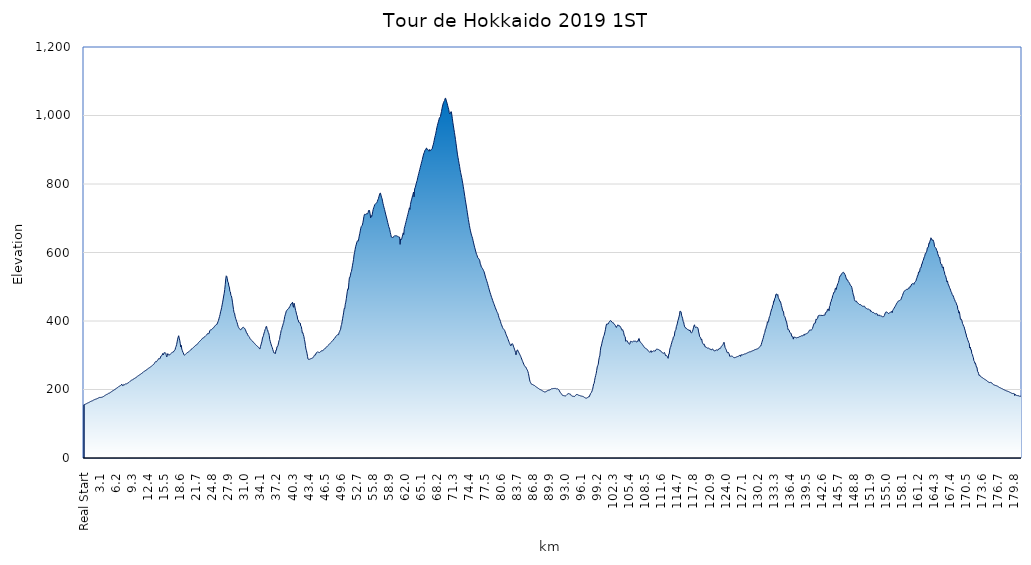
| Category | Ekevation |
|---|---|
| Real Start | 155.5 |
| 0.1  | 156.2 |
| 0.2  | 156.8 |
| 0.3  | 157.3 |
| 0.4  | 158.1 |
| 0.5  | 158.8 |
| 0.6  | 159.6 |
| 0.7  | 160.5 |
| 0.8  | 161.2 |
| 0.9  | 161.8 |
| 1.0  | 162.7 |
| 1.1  | 163.4 |
| 1.2  | 164.4 |
| 1.3  | 165.2 |
| 1.4  | 165.8 |
| 1.5  | 166.5 |
| 1.6  | 167 |
| 1.7  | 167.6 |
| 1.8  | 168.7 |
| 1.9  | 169.6 |
| 2.0  | 170.2 |
| 2.1  | 171 |
| 2.2  | 171.5 |
| 2.3  | 171.9 |
| 2.4  | 172.4 |
| 2.5  | 173.2 |
| 2.6  | 173.8 |
| 2.7  | 174.2 |
| 2.8  | 175.4 |
| 2.9  | 175.5 |
| 3.0  | 176.8 |
| 3.1  | 176.1 |
| 3.2  | 176.9 |
| 3.3  | 177.2 |
| 3.4  | 177.1 |
| 3.5  | 177.5 |
| 3.6  | 178.3 |
| 3.7  | 179.1 |
| 3.8  | 179.8 |
| 3.9  | 180.8 |
| 4.0  | 182.1 |
| 4.1  | 182.8 |
| 4.2  | 184.1 |
| 4.3  | 184.6 |
| 4.4  | 186 |
| 4.5  | 186.3 |
| 4.6  | 187 |
| 4.7  | 188.3 |
| 4.8  | 189.2 |
| 4.9  | 189.1 |
| 5.0  | 190.2 |
| 5.1  | 191.9 |
| 5.2  | 192.4 |
| 5.3  | 193.5 |
| 5.4  | 194.5 |
| 5.5  | 195.6 |
| 5.6  | 196 |
| 5.7  | 197.7 |
| 5.8  | 198.4 |
| 5.9  | 199.1 |
| 6.0  | 200.9 |
| 6.1  | 201.6 |
| 6.2  | 203 |
| 6.3  | 203.7 |
| 6.4  | 204.5 |
| 6.5  | 205.8 |
| 6.6  | 206.7 |
| 6.7  | 208.5 |
| 6.8  | 209.2 |
| 6.9  | 210.1 |
| 7.0  | 210.9 |
| 7.1  | 212 |
| 7.2  | 213.3 |
| 7.3  | 215.7 |
| 7.4  | 212 |
| 7.5  | 210.1 |
| 7.6  | 212.7 |
| 7.7  | 215 |
| 7.8  | 213.8 |
| 7.9  | 215.1 |
| 8.0  | 216.2 |
| 8.1  | 215.9 |
| 8.2  | 216.4 |
| 8.3  | 217.2 |
| 8.4  | 218.1 |
| 8.5  | 219 |
| 8.6  | 220 |
| 8.7  | 221.2 |
| 8.8  | 222.7 |
| 8.9  | 223.8 |
| 9.0  | 225 |
| 9.1  | 226.2 |
| 9.2  | 227.3 |
| 9.3  | 227.8 |
| 9.4  | 228.2 |
| 9.5  | 229.9 |
| 9.6  | 231 |
| 9.7  | 231.7 |
| 9.8  | 232.7 |
| 9.9  | 233.3 |
| 10.0  | 234.2 |
| 10.1  | 235.9 |
| 10.2  | 236.7 |
| 10.3  | 238 |
| 10.4  | 239.8 |
| 10.5  | 240.3 |
| 10.6  | 241.1 |
| 10.7  | 242.4 |
| 10.8  | 243.1 |
| 10.9  | 244.4 |
| 11.0  | 244.8 |
| 11.1  | 246.5 |
| 11.2  | 247.8 |
| 11.3  | 248.7 |
| 11.4  | 249.9 |
| 11.5  | 251.7 |
| 11.6  | 252.6 |
| 11.7  | 253.5 |
| 11.8  | 254.6 |
| 11.9  | 255.1 |
| 12.0  | 257.2 |
| 12.1  | 257.6 |
| 12.2  | 258.6 |
| 12.3  | 259.9 |
| 12.4  | 261.1 |
| 12.5  | 262.3 |
| 12.6  | 263.2 |
| 12.7  | 264.2 |
| 12.8  | 265.5 |
| 12.9  | 266.3 |
| 13.0  | 267.4 |
| 13.1  | 268.8 |
| 13.2  | 270 |
| 13.3  | 271.4 |
| 13.4  | 272.6 |
| 13.5  | 273.7 |
| 13.6  | 276 |
| 13.7  | 279 |
| 13.8  | 281 |
| 13.9  | 282 |
| 14.0  | 281 |
| 14.1  | 283 |
| 14.2  | 285 |
| 14.3  | 287 |
| 14.4  | 290 |
| 14.5  | 290 |
| 14.6  | 290 |
| 14.7  | 290 |
| 14.8  | 295 |
| 14.9  | 298 |
| 15.0  | 299 |
| 15.1  | 300 |
| 15.2  | 305 |
| 15.3  | 300.9 |
| 15.4  | 303.4 |
| 15.5  | 307.8 |
| 15.6  | 307 |
| 15.7  | 307.6 |
| 15.8  | 306 |
| 15.9  | 300.1 |
| 16.0  | 295.3 |
| 16.1  | 299.2 |
| 16.2  | 304.8 |
| 16.3  | 301.8 |
| 16.4  | 300.5 |
| 16.5  | 300.9 |
| 16.6  | 301.8 |
| 16.7  | 303.7 |
| 16.8  | 305.2 |
| 16.9  | 306.5 |
| 17.0  | 307.6 |
| 17.1  | 308.5 |
| 17.2  | 309.3 |
| 17.3  | 309.8 |
| 17.4  | 313 |
| 17.5  | 314 |
| 17.6  | 316 |
| 17.7  | 322 |
| 17.8  | 326 |
| 17.9  | 331 |
| 18.0  | 339 |
| 18.1  | 347 |
| 18.2  | 353 |
| 18.3  | 357 |
| 18.4  | 350 |
| 18.5  | 344 |
| 18.6  | 335 |
| 18.7  | 324 |
| 18.8  | 329 |
| 18.9  | 318 |
| 19.0  | 314 |
| 19.1  | 309 |
| 19.2  | 307 |
| 19.3  | 301.5 |
| 19.4  | 300.6 |
| 19.5  | 301 |
| 19.6  | 302.4 |
| 19.7  | 304.1 |
| 19.8  | 305.4 |
| 19.9  | 307.2 |
| 20.0  | 307.9 |
| 20.1  | 308.9 |
| 20.2  | 309.9 |
| 20.3  | 310.8 |
| 20.4  | 312 |
| 20.5  | 314 |
| 20.6  | 315.3 |
| 20.7  | 316.8 |
| 20.8  | 318.1 |
| 20.9  | 319.4 |
| 21.0  | 320.9 |
| 21.1  | 322.2 |
| 21.2  | 323.2 |
| 21.3  | 324.9 |
| 21.4  | 326.1 |
| 21.5  | 328 |
| 21.6  | 329.2 |
| 21.7  | 330 |
| 21.8  | 331 |
| 21.9  | 332.5 |
| 22.0  | 333.9 |
| 22.1  | 336.5 |
| 22.2  | 338 |
| 22.3  | 339.5 |
| 22.4  | 341.5 |
| 22.5  | 342.8 |
| 22.6  | 344.2 |
| 22.7  | 345.8 |
| 22.8  | 347.7 |
| 22.9  | 349.5 |
| 23.0  | 351 |
| 23.1  | 351.2 |
| 23.2  | 352.4 |
| 23.3  | 353.7 |
| 23.4  | 355 |
| 23.5  | 356.6 |
| 23.6  | 357.8 |
| 23.7  | 359 |
| 23.8  | 361.2 |
| 23.9  | 363.5 |
| 24.0  | 363.7 |
| 24.1  | 362.5 |
| 24.2  | 364.9 |
| 24.3  | 371.5 |
| 24.4  | 373.2 |
| 24.5  | 374.4 |
| 24.6  | 374.3 |
| 24.7  | 375.4 |
| 24.8  | 377.6 |
| 24.9  | 379 |
| 25.0  | 380 |
| 25.1  | 381 |
| 25.2  | 384 |
| 25.3  | 385 |
| 25.4  | 387 |
| 25.5  | 389 |
| 25.6  | 390 |
| 25.7  | 390 |
| 25.8  | 394 |
| 25.9  | 398 |
| 26.0  | 402 |
| 26.1  | 408 |
| 26.2  | 413 |
| 26.3  | 419 |
| 26.4  | 427 |
| 26.5  | 432 |
| 26.6  | 439 |
| 26.7  | 447 |
| 26.8  | 455 |
| 26.9  | 464 |
| 27.0  | 473 |
| 27.1  | 481 |
| 27.2  | 492 |
| 27.3  | 506 |
| 27.4  | 523 |
| 27.5  | 532 |
| 27.6  | 530 |
| 27.7  | 523 |
| 27.8  | 514 |
| 27.9  | 512 |
| 28.0  | 502 |
| 28.1  | 499 |
| 28.2  | 486 |
| 28.3  | 485 |
| 28.4  | 474 |
| 28.5  | 473 |
| 28.6  | 465 |
| 28.7  | 455 |
| 28.8  | 444 |
| 28.9  | 434 |
| 29.0  | 424 |
| 29.1  | 423 |
| 29.2  | 414 |
| 29.3  | 408 |
| 29.4  | 404 |
| 29.5  | 398 |
| 29.6  | 395 |
| 29.7  | 389 |
| 29.8  | 384 |
| 29.9  | 380.7 |
| 30.0  | 378 |
| 30.1  | 376.7 |
| 30.2  | 376 |
| 30.3  | 374.2 |
| 30.4  | 375.5 |
| 30.5  | 378.6 |
| 30.6  | 380 |
| 30.7  | 380 |
| 30.8  | 382 |
| 30.9  | 380.8 |
| 31.0  | 379.4 |
| 31.1  | 377.2 |
| 31.2  | 374.4 |
| 31.3  | 370.6 |
| 31.4  | 365.7 |
| 31.5  | 365 |
| 31.6  | 361.3 |
| 31.7  | 357.8 |
| 31.8  | 356.1 |
| 31.9  | 354.8 |
| 32.0  | 352 |
| 32.1  | 348.5 |
| 32.2  | 346.6 |
| 32.3  | 345.1 |
| 32.4  | 343.3 |
| 32.5  | 341.9 |
| 32.6  | 340.5 |
| 32.7  | 338.7 |
| 32.8  | 337.5 |
| 32.9  | 335.7 |
| 33.0  | 334 |
| 33.1  | 331.9 |
| 33.2  | 330.5 |
| 33.3  | 329.1 |
| 33.4  | 327.8 |
| 33.5  | 326.3 |
| 33.6  | 325.4 |
| 33.7  | 323.7 |
| 33.8  | 321.8 |
| 33.9  | 319.6 |
| 34.0  | 318.2 |
| 34.1  | 325 |
| 34.2  | 330.2 |
| 34.3  | 335.5 |
| 34.4  | 341.1 |
| 34.5  | 350.3 |
| 34.6  | 353.6 |
| 34.7  | 358.3 |
| 34.8  | 364.6 |
| 34.9  | 369 |
| 35.0  | 375 |
| 35.1  | 378 |
| 35.2  | 384 |
| 35.3  | 384 |
| 35.4  | 375 |
| 35.5  | 374 |
| 35.6  | 367 |
| 35.7  | 365 |
| 35.8  | 358 |
| 35.9  | 346 |
| 36.0  | 340.7 |
| 36.1  | 335 |
| 36.2  | 330 |
| 36.3  | 325.4 |
| 36.4  | 322.1 |
| 36.5  | 316.2 |
| 36.6  | 311.7 |
| 36.7  | 307 |
| 36.8  | 306.3 |
| 36.9  | 306.9 |
| 37.0  | 305.1 |
| 37.1  | 315 |
| 37.2  | 315 |
| 37.3  | 325 |
| 37.4  | 325 |
| 37.5  | 329 |
| 37.6  | 336 |
| 37.7  | 343 |
| 37.8  | 346 |
| 37.9  | 357 |
| 38.0  | 363 |
| 38.1  | 372 |
| 38.2  | 375 |
| 38.3  | 382 |
| 38.4  | 386 |
| 38.5  | 392 |
| 38.6  | 396 |
| 38.7  | 404 |
| 38.8  | 413 |
| 38.9  | 418 |
| 39.0  | 423 |
| 39.1  | 429 |
| 39.2  | 431 |
| 39.3  | 433 |
| 39.4  | 435 |
| 39.5  | 436 |
| 39.6  | 437 |
| 39.7  | 441 |
| 39.8  | 442 |
| 39.9  | 446 |
| 40.0  | 450 |
| 40.1  | 451 |
| 40.2  | 451 |
| 40.3  | 455 |
| 40.4  | 444 |
| 40.5  | 440 |
| 40.6  | 452 |
| 40.7  | 446 |
| 40.8  | 438 |
| 40.9  | 431 |
| 41.0  | 426 |
| 41.1  | 418 |
| 41.2  | 415 |
| 41.3  | 405 |
| 41.4  | 403 |
| 41.5  | 397 |
| 41.6  | 395 |
| 41.7  | 395 |
| 41.8  | 394 |
| 41.9  | 385 |
| 42.0  | 384 |
| 42.1  | 375 |
| 42.2  | 365 |
| 42.3  | 366 |
| 42.4  | 360 |
| 42.5  | 355 |
| 42.6  | 346 |
| 42.7  | 339 |
| 42.8  | 328 |
| 42.9  | 318 |
| 43.0  | 313 |
| 43.1  | 306 |
| 43.2  | 297 |
| 43.3  | 289 |
| 43.4  | 288 |
| 43.5  | 287.6 |
| 43.6  | 288.3 |
| 43.7  | 288.8 |
| 43.8  | 289.8 |
| 43.9  | 290.6 |
| 44.0  | 290.7 |
| 44.1  | 291.6 |
| 44.2  | 292.5 |
| 44.3  | 293.3 |
| 44.4  | 295.9 |
| 44.5  | 299.5 |
| 44.6  | 300.4 |
| 44.7  | 300.2 |
| 44.8  | 303.5 |
| 44.9  | 307 |
| 45.0  | 308 |
| 45.1  | 309.6 |
| 45.2  | 310 |
| 45.3  | 309 |
| 45.4  | 308.2 |
| 45.5  | 307.9 |
| 45.6  | 308.9 |
| 45.7  | 310.1 |
| 45.8  | 311.9 |
| 45.9  | 313 |
| 46.0  | 312.4 |
| 46.1  | 313 |
| 46.2  | 314.9 |
| 46.3  | 316 |
| 46.4  | 317.2 |
| 46.5  | 318.1 |
| 46.6  | 320.3 |
| 46.7  | 321.6 |
| 46.8  | 323 |
| 46.9  | 324.3 |
| 47.0  | 325.5 |
| 47.1  | 327 |
| 47.2  | 328.4 |
| 47.3  | 331.1 |
| 47.4  | 331.9 |
| 47.5  | 333.5 |
| 47.6  | 335.4 |
| 47.7  | 337 |
| 47.8  | 338.4 |
| 47.9  | 340.2 |
| 48.0  | 341.8 |
| 48.1  | 343.6 |
| 48.2  | 344.7 |
| 48.3  | 347.5 |
| 48.4  | 349 |
| 48.5  | 350.6 |
| 48.6  | 353.7 |
| 48.7  | 355 |
| 48.8  | 357 |
| 48.9  | 358 |
| 49.0  | 360 |
| 49.1  | 361 |
| 49.2  | 360 |
| 49.3  | 366 |
| 49.4  | 369 |
| 49.5  | 373 |
| 49.6  | 376 |
| 49.7  | 386 |
| 49.8  | 390 |
| 49.9  | 399 |
| 50.0  | 408 |
| 50.1  | 417 |
| 50.2  | 426 |
| 50.3  | 437 |
| 50.4  | 436 |
| 50.5  | 449 |
| 50.6  | 455 |
| 50.7  | 465 |
| 50.8  | 476 |
| 50.9  | 487 |
| 51.0  | 494 |
| 51.1  | 493 |
| 51.2  | 513 |
| 51.3  | 527 |
| 51.4  | 527 |
| 51.5  | 534 |
| 51.6  | 542 |
| 51.7  | 545 |
| 51.8  | 554 |
| 51.9  | 563 |
| 52.0  | 571 |
| 52.1  | 580 |
| 52.2  | 593 |
| 52.3  | 600 |
| 52.4  | 609 |
| 52.5  | 617 |
| 52.6  | 622 |
| 52.7  | 628 |
| 52.8  | 633 |
| 52.9  | 634 |
| 53.0  | 633 |
| 53.1  | 640 |
| 53.2  | 648 |
| 53.3  | 655 |
| 53.4  | 663 |
| 53.5  | 671 |
| 53.6  | 676 |
| 53.7  | 678 |
| 53.8  | 680 |
| 53.9  | 687 |
| 54.0  | 695 |
| 54.1  | 705 |
| 54.2  | 711 |
| 54.3  | 712 |
| 54.4  | 711 |
| 54.5  | 713 |
| 54.6  | 713 |
| 54.7  | 712 |
| 54.8  | 713 |
| 54.9  | 716 |
| 55.0  | 722 |
| 55.1  | 724 |
| 55.2  | 721 |
| 55.3  | 713 |
| 55.4  | 701 |
| 55.5  | 708 |
| 55.6  | 705 |
| 55.7  | 710 |
| 55.8  | 719 |
| 55.9  | 726 |
| 56.0  | 731 |
| 56.1  | 735 |
| 56.2  | 740 |
| 56.3  | 741 |
| 56.4  | 743 |
| 56.5  | 744 |
| 56.6  | 746 |
| 56.7  | 749 |
| 56.8  | 754 |
| 56.9  | 757 |
| 57.0  | 763 |
| 57.1  | 768 |
| 57.2  | 773 |
| 57.3  | 773.4 |
| 57.4  | 767.5 |
| 57.5  | 761.5 |
| 57.6  | 757.9 |
| 57.7  | 750 |
| 57.8  | 742.8 |
| 57.9  | 736.6 |
| 58.0  | 730.7 |
| 58.1  | 725.2 |
| 58.2  | 718.6 |
| 58.3  | 712.3 |
| 58.4  | 706.4 |
| 58.5  | 700.7 |
| 58.6  | 694.6 |
| 58.7  | 687.6 |
| 58.8  | 682.5 |
| 58.9  | 675.5 |
| 59.0  | 671.5 |
| 59.1  | 666.3 |
| 59.2  | 658.4 |
| 59.3  | 652.3 |
| 59.4  | 645.1 |
| 59.5  | 644.2 |
| 59.6  | 644 |
| 59.7  | 643 |
| 59.8  | 645.9 |
| 59.9  | 646.8 |
| 60.0  | 648.7 |
| 60.1  | 648.8 |
| 60.2  | 648.9 |
| 60.3  | 648.8 |
| 60.4  | 648.7 |
| 60.5  | 648.2 |
| 60.6  | 647.3 |
| 60.7  | 646.5 |
| 60.8  | 645.6 |
| 60.9  | 644.7 |
| 61.0  | 644.9 |
| 61.1  | 623.6 |
| 61.2  | 639.6 |
| 61.3  | 637.3 |
| 61.4  | 639.6 |
| 61.5  | 645.4 |
| 61.6  | 651.3 |
| 61.7  | 657.3 |
| 61.8  | 652.3 |
| 61.9  | 669.8 |
| 62.0  | 675.3 |
| 62.1  | 681.1 |
| 62.2  | 687.4 |
| 62.3  | 693.3 |
| 62.4  | 699.6 |
| 62.5  | 705.5 |
| 62.6  | 711.5 |
| 62.7  | 717.6 |
| 62.8  | 723.7 |
| 62.9  | 730.6 |
| 63.0  | 725.6 |
| 63.1  | 740.3 |
| 63.2  | 747.4 |
| 63.3  | 753.7 |
| 63.4  | 759 |
| 63.5  | 765.7 |
| 63.6  | 770.3 |
| 63.7  | 776.6 |
| 63.8  | 762.5 |
| 63.9  | 785.3 |
| 64.0  | 788.9 |
| 64.1  | 794.2 |
| 64.2  | 800.4 |
| 64.3  | 806.1 |
| 64.4  | 810.8 |
| 64.5  | 818.6 |
| 64.6  | 824.4 |
| 64.7  | 830.4 |
| 64.8  | 836.6 |
| 64.9  | 842.4 |
| 65.0  | 848.5 |
| 65.1  | 854.4 |
| 65.2  | 860.4 |
| 65.3  | 866.3 |
| 65.4  | 871.8 |
| 65.5  | 878.7 |
| 65.6  | 884.5 |
| 65.7  | 890.1 |
| 65.8  | 892.8 |
| 65.9  | 898.3 |
| 66.0  | 900.6 |
| 66.1  | 903.6 |
| 66.2  | 905 |
| 66.3  | 900 |
| 66.4  | 901.2 |
| 66.5  | 900.5 |
| 66.6  | 898.9 |
| 66.7  | 895.5 |
| 66.8  | 900.7 |
| 66.9  | 898 |
| 67.0  | 897.6 |
| 67.1  | 900.9 |
| 67.2  | 901.3 |
| 67.3  | 902.8 |
| 67.4  | 910.3 |
| 67.5  | 914.1 |
| 67.6  | 921.3 |
| 67.7  | 928.1 |
| 67.8  | 936 |
| 67.9  | 941.8 |
| 68.0  | 948.3 |
| 68.1  | 956.4 |
| 68.2  | 964.4 |
| 68.3  | 970.4 |
| 68.4  | 976.8 |
| 68.5  | 981.6 |
| 68.6  | 987.7 |
| 68.7  | 993.3 |
| 68.8  | 993.9 |
| 68.9  | 996.6 |
| 69.0  | 1006 |
| 69.1  | 1011.4 |
| 69.2  | 1020.8 |
| 69.3  | 1027.6 |
| 69.4  | 1033.5 |
| 69.5  | 1038.3 |
| 69.6  | 1041.6 |
| 69.7  | 1043.7 |
| 69.8  | 1050.1 |
| 69.9  | 1050.3 |
| 70.0  | 1045 |
| 70.1  | 1039.6 |
| 70.2  | 1035.1 |
| 70.3  | 1028.4 |
| 70.4  | 1022.9 |
| 70.5  | 1017.3 |
| 70.6  | 1008.3 |
| 70.7  | 1004.6 |
| 70.8  | 1007.9 |
| 70.9  | 1010.8 |
| 71.0  | 1010.9 |
| 71.1  | 1001.4 |
| 71.2  | 990.6 |
| 71.3  | 979.2 |
| 71.4  | 969.6 |
| 71.5  | 959.7 |
| 71.6  | 950.3 |
| 71.7  | 940.4 |
| 71.8  | 930.2 |
| 71.9  | 919.1 |
| 72.0  | 907.8 |
| 72.1  | 896.4 |
| 72.2  | 885 |
| 72.3  | 877 |
| 72.4  | 867.8 |
| 72.5  | 859.6 |
| 72.6  | 851.2 |
| 72.7  | 841.4 |
| 72.8  | 833.3 |
| 72.9  | 826.4 |
| 73.0  | 819.3 |
| 73.1  | 811.2 |
| 73.2  | 802.3 |
| 73.3  | 793.3 |
| 73.4  | 783.7 |
| 73.5  | 773.9 |
| 73.6  | 764 |
| 73.7  | 753.9 |
| 73.8  | 744.6 |
| 73.9  | 735.6 |
| 74.0  | 725.9 |
| 74.1  | 715.9 |
| 74.2  | 705.8 |
| 74.3  | 696.1 |
| 74.4  | 687.3 |
| 74.5  | 678.4 |
| 74.6  | 670.4 |
| 74.7  | 663.2 |
| 74.8  | 656.7 |
| 74.9  | 650.8 |
| 75.0  | 646.5 |
| 75.1  | 641.5 |
| 75.2  | 634.6 |
| 75.3  | 628.1 |
| 75.4  | 621.6 |
| 75.5  | 615.2 |
| 75.6  | 610 |
| 75.7  | 604.4 |
| 75.8  | 598.3 |
| 75.9  | 594.1 |
| 76.0  | 590.4 |
| 76.1  | 584.9 |
| 76.2  | 583.8 |
| 76.3  | 581.6 |
| 76.4  | 579.6 |
| 76.5  | 575.6 |
| 76.6  | 566.7 |
| 76.7  | 563.9 |
| 76.8  | 557.6 |
| 76.9  | 555.8 |
| 77.0  | 553.8 |
| 77.1  | 551.2 |
| 77.2  | 547.9 |
| 77.3  | 545.1 |
| 77.4  | 540.2 |
| 77.5  | 534.4 |
| 77.6  | 528.5 |
| 77.7  | 523.6 |
| 77.8  | 519.1 |
| 77.9  | 514.4 |
| 78.0  | 509.6 |
| 78.1  | 504 |
| 78.2  | 498.1 |
| 78.3  | 492.9 |
| 78.4  | 487.6 |
| 78.5  | 482.5 |
| 78.6  | 477.8 |
| 78.7  | 472.8 |
| 78.8  | 468.3 |
| 78.9  | 464.1 |
| 79.0  | 459.7 |
| 79.1  | 455.1 |
| 79.2  | 451.4 |
| 79.3  | 447.3 |
| 79.4  | 443.3 |
| 79.5  | 438.8 |
| 79.6  | 435 |
| 79.7  | 431.7 |
| 79.8  | 427.4 |
| 79.9  | 424.5 |
| 80.0  | 421.8 |
| 80.1  | 416.3 |
| 80.2  | 410.3 |
| 80.3  | 406.5 |
| 80.4  | 403 |
| 80.5  | 398.4 |
| 80.6  | 392.9 |
| 80.7  | 389 |
| 80.8  | 385.2 |
| 80.9  | 381.2 |
| 81.0  | 378.2 |
| 81.1  | 376.5 |
| 81.2  | 374.8 |
| 81.3  | 372.5 |
| 81.4  | 368.5 |
| 81.5  | 364.1 |
| 81.6  | 359.9 |
| 81.7  | 356.5 |
| 81.8  | 353.1 |
| 81.9  | 348.9 |
| 82.0  | 345.1 |
| 82.1  | 341 |
| 82.2  | 337 |
| 82.3  | 333.5 |
| 82.4  | 330.1 |
| 82.5  | 327.5 |
| 82.6  | 329.8 |
| 82.7  | 333.3 |
| 82.8  | 333.8 |
| 82.9  | 331.2 |
| 83.0  | 326.6 |
| 83.1  | 322.2 |
| 83.2  | 317.8 |
| 83.3  | 313.2 |
| 83.4  | 308.8 |
| 83.5  | 301.2 |
| 83.6  | 308.5 |
| 83.7  | 314.9 |
| 83.8  | 315.6 |
| 83.9  | 312.1 |
| 84.0  | 309.2 |
| 84.1  | 306.1 |
| 84.2  | 303.2 |
| 84.3  | 300 |
| 84.4  | 296.9 |
| 84.5  | 292.9 |
| 84.6  | 289 |
| 84.7  | 285.2 |
| 84.8  | 281.4 |
| 84.9  | 277.6 |
| 85.0  | 273.9 |
| 85.1  | 270.5 |
| 85.2  | 267.5 |
| 85.3  | 266.7 |
| 85.4  | 265.5 |
| 85.5  | 262.1 |
| 85.6  | 259.1 |
| 85.7  | 256.4 |
| 85.8  | 252.2 |
| 85.9  | 246.8 |
| 86.0  | 239 |
| 86.1  | 230.5 |
| 86.2  | 223.9 |
| 86.3  | 220.8 |
| 86.4  | 218 |
| 86.5  | 215.4 |
| 86.6  | 214.8 |
| 86.7  | 214.5 |
| 86.8  | 213.7 |
| 86.9  | 212.8 |
| 87.0  | 212.3 |
| 87.1  | 211.3 |
| 87.2  | 210 |
| 87.3  | 208.7 |
| 87.4  | 207.7 |
| 87.5  | 206.5 |
| 87.6  | 205.4 |
| 87.7  | 204.7 |
| 87.8  | 203.6 |
| 87.9  | 202.4 |
| 88.0  | 201.3 |
| 88.1  | 200.2 |
| 88.2  | 199.6 |
| 88.3  | 199.2 |
| 88.4  | 198.2 |
| 88.5  | 197.4 |
| 88.6  | 196.3 |
| 88.7  | 195.4 |
| 88.8  | 194.5 |
| 88.9  | 193.6 |
| 89.0  | 193 |
| 89.1  | 192.7 |
| 89.2  | 193.2 |
| 89.3  | 194.1 |
| 89.4  | 194.8 |
| 89.5  | 195.8 |
| 89.6  | 196.7 |
| 89.7  | 197.6 |
| 89.8  | 197.8 |
| 89.9  | 197.9 |
| 90.0  | 198.7 |
| 90.1  | 199.3 |
| 90.2  | 200.3 |
| 90.3  | 201.7 |
| 90.4  | 202.1 |
| 90.5  | 202.1 |
| 90.6  | 202.6 |
| 90.7  | 202.9 |
| 90.8  | 202.8 |
| 90.9  | 202.9 |
| 91.0  | 203.3 |
| 91.1  | 203.4 |
| 91.2  | 202.2 |
| 91.3  | 201.8 |
| 91.4  | 201.9 |
| 91.5  | 202.1 |
| 91.6  | 201.2 |
| 91.7  | 200.2 |
| 91.8  | 198.9 |
| 91.9  | 196 |
| 92.0  | 192.6 |
| 92.1  | 190.7 |
| 92.2  | 188.8 |
| 92.3  | 186.6 |
| 92.4  | 184.4 |
| 92.5  | 183 |
| 92.6  | 182.4 |
| 92.7  | 182.2 |
| 92.8  | 181.9 |
| 92.9  | 181.5 |
| 93.0  | 181.2 |
| 93.1  | 181.5 |
| 93.2  | 182.7 |
| 93.3  | 184.2 |
| 93.4  | 185.9 |
| 93.5  | 187.1 |
| 93.6  | 187.7 |
| 93.7  | 188.3 |
| 93.8  | 188 |
| 93.9  | 185.9 |
| 94.0  | 186.2 |
| 94.1  | 185.1 |
| 94.2  | 182.1 |
| 94.3  | 180.6 |
| 94.4  | 180.5 |
| 94.5  | 180.4 |
| 94.6  | 180.1 |
| 94.7  | 179.5 |
| 94.8  | 179.5 |
| 94.9  | 180.9 |
| 95.0  | 182.8 |
| 95.1  | 184.8 |
| 95.2  | 185.2 |
| 95.3  | 185.8 |
| 95.4  | 185 |
| 95.5  | 184.3 |
| 95.6  | 183.2 |
| 95.7  | 182.8 |
| 95.8  | 182.5 |
| 95.9  | 182.1 |
| 96.0  | 181.2 |
| 96.1  | 181 |
| 96.2  | 180.5 |
| 96.3  | 180.3 |
| 96.4  | 179.8 |
| 96.5  | 179.2 |
| 96.6  | 178.5 |
| 96.7  | 177.3 |
| 96.8  | 176.3 |
| 96.9  | 175.5 |
| 97.0  | 174.8 |
| 97.1  | 174.8 |
| 97.2  | 175.1 |
| 97.3  | 176.1 |
| 97.4  | 177.3 |
| 97.5  | 178.5 |
| 97.6  | 177.8 |
| 97.7  | 181 |
| 97.8  | 184 |
| 97.9  | 188 |
| 98.0  | 190 |
| 98.1  | 192 |
| 98.2  | 196 |
| 98.3  | 200 |
| 98.4  | 208 |
| 98.5  | 216 |
| 98.6  | 218 |
| 98.7  | 227 |
| 98.8  | 235 |
| 98.9  | 241 |
| 99.0  | 247 |
| 99.1  | 256 |
| 99.2  | 266 |
| 99.3  | 270 |
| 99.4  | 274 |
| 99.5  | 286 |
| 99.6  | 294 |
| 99.7  | 298 |
| 99.8  | 313 |
| 99.9  | 324 |
| 100.0  | 327 |
| 100.1  | 335 |
| 100.2  | 342 |
| 100.3  | 347 |
| 100.4  | 354 |
| 100.5  | 357 |
| 100.6  | 362 |
| 100.7  | 369 |
| 100.8  | 376 |
| 100.9  | 385 |
| 101.0  | 391 |
| 101.1  | 391 |
| 101.2  | 391 |
| 101.3  | 391 |
| 101.4  | 395 |
| 101.5  | 396 |
| 101.6  | 399 |
| 101.7  | 401 |
| 101.8  | 401 |
| 101.9  | 400 |
| 102.0  | 397 |
| 102.1  | 396 |
| 102.2  | 395 |
| 102.3  | 395 |
| 102.4  | 392 |
| 102.5  | 391 |
| 102.6  | 389 |
| 102.7  | 387 |
| 102.8  | 383 |
| 102.9  | 381 |
| 103.0  | 385 |
| 103.1  | 386 |
| 103.2  | 389 |
| 103.3  | 387 |
| 103.4  | 385 |
| 103.5  | 386 |
| 103.6  | 385 |
| 103.7  | 382 |
| 103.8  | 380 |
| 103.9  | 375 |
| 104.0  | 373 |
| 104.1  | 375 |
| 104.2  | 371 |
| 104.3  | 367 |
| 104.4  | 359 |
| 104.5  | 355 |
| 104.6  | 354 |
| 104.7  | 341 |
| 104.8  | 341 |
| 104.9  | 343 |
| 105.0  | 342 |
| 105.1  | 339 |
| 105.2  | 336 |
| 105.3  | 334 |
| 105.4  | 332 |
| 105.5  | 333 |
| 105.6  | 340 |
| 105.7  | 341 |
| 105.8  | 340 |
| 105.9  | 340 |
| 106.0  | 339 |
| 106.1  | 340 |
| 106.2  | 341 |
| 106.3  | 342 |
| 106.4  | 341 |
| 106.5  | 342 |
| 106.6  | 341 |
| 106.7  | 340 |
| 106.8  | 339 |
| 106.9  | 339 |
| 107.0  | 342 |
| 107.1  | 341 |
| 107.2  | 348 |
| 107.3  | 349 |
| 107.4  | 341.3 |
| 107.5  | 338.9 |
| 107.6  | 337.7 |
| 107.7  | 335.6 |
| 107.8  | 334.1 |
| 107.9  | 331.8 |
| 108.0  | 330.1 |
| 108.1  | 327.7 |
| 108.2  | 325.5 |
| 108.3  | 322.9 |
| 108.4  | 321.6 |
| 108.5  | 320.5 |
| 108.6  | 320 |
| 108.7  | 318.8 |
| 108.8  | 317.4 |
| 108.9  | 316.6 |
| 109.0  | 314.1 |
| 109.1  | 311.8 |
| 109.2  | 310.5 |
| 109.3  | 309.4 |
| 109.4  | 308.9 |
| 109.5  | 309.7 |
| 109.6  | 313.5 |
| 109.7  | 308.7 |
| 109.8  | 310 |
| 109.9  | 311 |
| 110.0  | 312 |
| 110.1  | 313 |
| 110.2  | 313 |
| 110.3  | 312 |
| 110.4  | 312 |
| 110.5  | 315 |
| 110.6  | 317 |
| 110.7  | 318 |
| 110.8  | 318 |
| 110.9  | 317 |
| 111.0  | 317 |
| 111.1  | 316 |
| 111.2  | 315 |
| 111.3  | 315 |
| 111.4  | 313 |
| 111.5  | 312 |
| 111.6  | 310 |
| 111.7  | 309 |
| 111.8  | 307 |
| 111.9  | 306 |
| 112.0  | 306 |
| 112.1  | 306 |
| 112.2  | 308 |
| 112.3  | 304 |
| 112.4  | 299 |
| 112.5  | 299 |
| 112.6  | 299 |
| 112.7  | 297 |
| 112.8  | 294 |
| 112.9  | 291 |
| 113.0  | 303 |
| 113.1  | 303 |
| 113.2  | 315 |
| 113.3  | 322 |
| 113.4  | 324 |
| 113.5  | 332 |
| 113.6  | 336 |
| 113.7  | 343 |
| 113.8  | 344 |
| 113.9  | 353 |
| 114.0  | 354 |
| 114.1  | 356 |
| 114.2  | 368 |
| 114.3  | 372 |
| 114.4  | 375 |
| 114.5  | 384 |
| 114.6  | 388 |
| 114.7  | 394 |
| 114.8  | 401 |
| 114.9  | 406 |
| 115.0  | 412 |
| 115.1  | 418 |
| 115.2  | 429 |
| 115.3  | 428 |
| 115.4  | 427 |
| 115.5  | 417 |
| 115.6  | 412 |
| 115.7  | 408 |
| 115.8  | 399 |
| 115.9  | 397 |
| 116.0  | 389 |
| 116.1  | 383 |
| 116.2  | 382 |
| 116.3  | 379 |
| 116.4  | 379 |
| 116.5  | 377 |
| 116.6  | 376 |
| 116.7  | 375 |
| 116.8  | 375 |
| 116.9  | 373 |
| 117.0  | 371 |
| 117.1  | 374 |
| 117.2  | 371 |
| 117.3  | 367 |
| 117.4  | 365 |
| 117.5  | 366 |
| 117.6  | 370 |
| 117.7  | 374 |
| 117.8  | 380 |
| 117.9  | 386 |
| 118.0  | 389 |
| 118.1  | 383 |
| 118.2  | 381 |
| 118.3  | 382 |
| 118.4  | 382 |
| 118.5  | 381 |
| 118.6  | 381 |
| 118.7  | 377 |
| 118.8  | 368 |
| 118.9  | 362 |
| 119.0  | 354 |
| 119.1  | 353 |
| 119.2  | 351 |
| 119.3  | 345 |
| 119.4  | 347 |
| 119.5  | 338 |
| 119.6  | 335 |
| 119.7  | 332 |
| 119.8  | 331 |
| 119.9  | 332 |
| 120.0  | 327 |
| 120.1  | 323.8 |
| 120.2  | 324.3 |
| 120.3  | 323 |
| 120.4  | 322 |
| 120.5  | 320.9 |
| 120.6  | 320.9 |
| 120.7  | 320.9 |
| 120.8  | 319.8 |
| 120.9  | 318.8 |
| 121.0  | 319 |
| 121.1  | 317.7 |
| 121.2  | 315.5 |
| 121.3  | 315.9 |
| 121.4  | 318 |
| 121.5  | 318 |
| 121.6  | 317 |
| 121.7  | 314 |
| 121.8  | 313 |
| 121.9  | 313 |
| 122.0  | 313 |
| 122.1  | 315 |
| 122.2  | 316 |
| 122.3  | 315 |
| 122.4  | 314 |
| 122.5  | 315 |
| 122.6  | 318 |
| 122.7  | 317 |
| 122.8  | 320 |
| 122.9  | 320 |
| 123.0  | 320 |
| 123.1  | 323 |
| 123.2  | 326 |
| 123.3  | 328 |
| 123.4  | 329 |
| 123.5  | 331 |
| 123.6  | 335 |
| 123.7  | 338 |
| 123.8  | 332 |
| 123.9  | 323 |
| 124.0  | 320 |
| 124.1  | 317 |
| 124.2  | 313 |
| 124.3  | 308 |
| 124.4  | 307 |
| 124.5  | 309 |
| 124.6  | 306 |
| 124.7  | 304 |
| 124.8  | 296.9 |
| 124.9  | 296.4 |
| 125.0  | 297.6 |
| 125.1  | 297.3 |
| 125.2  | 297.9 |
| 125.3  | 297.3 |
| 125.4  | 296.1 |
| 125.5  | 295 |
| 125.6  | 293.2 |
| 125.7  | 293 |
| 125.8  | 293 |
| 125.9  | 293.6 |
| 126.0  | 294.1 |
| 126.1  | 295 |
| 126.2  | 295.5 |
| 126.3  | 296.1 |
| 126.4  | 296.7 |
| 126.5  | 297.3 |
| 126.6  | 298 |
| 126.7  | 299.4 |
| 126.8  | 300.8 |
| 126.9  | 296.7 |
| 127.0  | 301.7 |
| 127.1  | 301 |
| 127.2  | 300.8 |
| 127.3  | 301.3 |
| 127.4  | 302 |
| 127.5  | 302.5 |
| 127.6  | 303.2 |
| 127.7  | 303.9 |
| 127.8  | 304 |
| 127.9  | 304.5 |
| 128.0  | 305 |
| 128.1  | 306.3 |
| 128.2  | 306.9 |
| 128.3  | 307.6 |
| 128.4  | 308.2 |
| 128.5  | 309 |
| 128.6  | 309.6 |
| 128.7  | 310.3 |
| 128.8  | 310.1 |
| 128.9  | 311 |
| 129.0  | 311.6 |
| 129.1  | 311.9 |
| 129.2  | 312.9 |
| 129.3  | 313.5 |
| 129.4  | 314 |
| 129.5  | 315 |
| 129.6  | 315.8 |
| 129.7  | 316.3 |
| 129.8  | 316.9 |
| 129.9  | 317 |
| 130.0  | 318 |
| 130.1  | 318.8 |
| 130.2  | 318.9 |
| 130.3  | 320 |
| 130.4  | 321 |
| 130.5  | 322.4 |
| 130.6  | 325.1 |
| 130.7  | 326.2 |
| 130.8  | 327 |
| 130.9  | 331.1 |
| 131.0  | 336.6 |
| 131.1  | 341.5 |
| 131.2  | 346.5 |
| 131.3  | 351.1 |
| 131.4  | 357.8 |
| 131.5  | 363 |
| 131.6  | 367 |
| 131.7  | 376 |
| 131.8  | 377 |
| 131.9  | 385 |
| 132.0  | 388 |
| 132.1  | 398 |
| 132.2  | 396 |
| 132.3  | 398 |
| 132.4  | 408 |
| 132.5  | 413 |
| 132.6  | 416 |
| 132.7  | 424 |
| 132.8  | 429 |
| 132.9  | 435 |
| 133.0  | 437 |
| 133.1  | 446 |
| 133.2  | 447 |
| 133.3  | 458 |
| 133.4  | 457 |
| 133.5  | 466 |
| 133.6  | 467 |
| 133.7  | 476 |
| 133.8  | 479 |
| 133.9  | 479 |
| 134.0  | 475 |
| 134.1  | 477 |
| 134.2  | 468 |
| 134.3  | 465 |
| 134.4  | 462 |
| 134.5  | 457 |
| 134.6  | 457 |
| 134.7  | 452 |
| 134.8  | 445 |
| 134.9  | 440 |
| 135.0  | 432 |
| 135.1  | 428 |
| 135.2  | 428 |
| 135.3  | 416 |
| 135.4  | 414 |
| 135.5  | 411 |
| 135.6  | 406 |
| 135.7  | 400 |
| 135.8  | 397 |
| 135.9  | 389 |
| 136.0  | 381 |
| 136.1  | 374 |
| 136.2  | 375 |
| 136.3  | 373 |
| 136.4  | 367 |
| 136.5  | 366 |
| 136.6  | 365 |
| 136.7  | 362 |
| 136.8  | 355 |
| 136.9  | 355.2 |
| 137.0  | 354.1 |
| 137.1  | 347 |
| 137.2  | 353.3 |
| 137.3  | 353.2 |
| 137.4  | 351.9 |
| 137.5  | 352.1 |
| 137.6  | 351.4 |
| 137.7  | 350.8 |
| 137.8  | 351.3 |
| 137.9  | 351.8 |
| 138.0  | 352.2 |
| 138.1  | 352.4 |
| 138.2  | 353.7 |
| 138.3  | 354.3 |
| 138.4  | 354.6 |
| 138.5  | 355.2 |
| 138.6  | 356.2 |
| 138.7  | 356.9 |
| 138.8  | 356.8 |
| 138.9  | 356.9 |
| 139.0  | 357.4 |
| 139.1  | 360.2 |
| 139.2  | 358.2 |
| 139.3  | 361.5 |
| 139.4  | 361.5 |
| 139.5  | 362 |
| 139.6  | 362.8 |
| 139.7  | 363.4 |
| 139.8  | 364.5 |
| 139.9  | 365.2 |
| 140.0  | 366.5 |
| 140.1  | 369.8 |
| 140.2  | 372.8 |
| 140.3  | 373.8 |
| 140.4  | 373.6 |
| 140.5  | 374 |
| 140.6  | 373.9 |
| 140.7  | 375.1 |
| 140.8  | 378.1 |
| 140.9  | 382.9 |
| 141.0  | 388 |
| 141.1  | 391.7 |
| 141.2  | 394 |
| 141.3  | 393 |
| 141.4  | 397 |
| 141.5  | 406 |
| 141.6  | 404 |
| 141.7  | 407 |
| 141.8  | 408 |
| 141.9  | 415 |
| 142.0  | 416 |
| 142.1  | 416 |
| 142.2  | 417 |
| 142.3  | 417 |
| 142.4  | 416 |
| 142.5  | 417 |
| 142.6  | 415 |
| 142.7  | 417 |
| 142.8  | 415 |
| 142.9  | 417 |
| 143.0  | 417 |
| 143.1  | 417 |
| 143.2  | 417 |
| 143.3  | 424 |
| 143.4  | 424 |
| 143.5  | 427 |
| 143.6  | 427 |
| 143.7  | 434 |
| 143.8  | 434 |
| 143.9  | 435 |
| 144.0  | 430 |
| 144.1  | 443 |
| 144.2  | 445 |
| 144.3  | 455 |
| 144.4  | 456 |
| 144.5  | 464 |
| 144.6  | 466 |
| 144.7  | 474 |
| 144.8  | 477 |
| 144.9  | 483 |
| 145.0  | 485 |
| 145.1  | 484 |
| 145.2  | 495 |
| 145.3  | 496 |
| 145.4  | 492 |
| 145.5  | 500 |
| 145.6  | 505 |
| 145.7  | 509 |
| 145.8  | 512 |
| 145.9  | 518 |
| 146.0  | 526 |
| 146.1  | 531 |
| 146.2  | 531 |
| 146.3  | 534 |
| 146.4  | 537 |
| 146.5  | 539 |
| 146.6  | 541 |
| 146.7  | 541 |
| 146.8  | 542 |
| 146.9  | 541 |
| 147.0  | 537 |
| 147.1  | 536 |
| 147.2  | 531 |
| 147.3  | 526 |
| 147.4  | 521 |
| 147.5  | 521 |
| 147.6  | 520 |
| 147.7  | 515 |
| 147.8  | 514 |
| 147.9  | 512 |
| 148.0  | 509 |
| 148.1  | 505 |
| 148.2  | 503 |
| 148.3  | 502 |
| 148.4  | 498 |
| 148.5  | 491 |
| 148.6  | 483 |
| 148.7  | 476 |
| 148.8  | 473 |
| 148.9  | 463 |
| 149.0  | 459 |
| 149.1  | 458 |
| 149.2  | 457 |
| 149.3  | 458 |
| 149.4  | 455 |
| 149.5  | 453 |
| 149.6  | 452 |
| 149.7  | 451 |
| 149.8  | 449 |
| 149.9  | 448 |
| 150.0  | 447 |
| 150.1  | 448 |
| 150.2  | 447 |
| 150.3  | 445 |
| 150.4  | 444 |
| 150.5  | 443 |
| 150.6  | 443 |
| 150.7  | 443 |
| 150.8  | 444 |
| 150.9  | 442 |
| 151.0  | 439 |
| 151.1  | 438 |
| 151.2  | 437 |
| 151.3  | 436 |
| 151.4  | 435 |
| 151.5  | 435 |
| 151.6  | 435 |
| 151.7  | 434 |
| 151.8  | 433 |
| 151.9  | 432 |
| 152.0  | 432 |
| 152.1  | 427 |
| 152.2  | 428 |
| 152.3  | 427 |
| 152.4  | 425 |
| 152.5  | 425 |
| 152.6  | 425 |
| 152.7  | 424 |
| 152.8  | 422 |
| 152.9  | 421 |
| 153.0  | 421 |
| 153.1  | 421 |
| 153.2  | 422 |
| 153.3  | 421 |
| 153.4  | 416 |
| 153.5  | 416 |
| 153.6  | 417 |
| 153.7  | 418 |
| 153.8  | 415.3 |
| 153.9  | 414.3 |
| 154.0  | 415.9 |
| 154.1  | 414.6 |
| 154.2  | 413.5 |
| 154.3  | 412.8 |
| 154.4  | 412.4 |
| 154.5  | 412.7 |
| 154.6  | 413 |
| 154.7  | 416.1 |
| 154.8  | 420.4 |
| 154.9  | 424.5 |
| 155.0  | 426.6 |
| 155.1  | 426.1 |
| 155.2  | 426.4 |
| 155.3  | 424.6 |
| 155.4  | 422.4 |
| 155.5  | 422 |
| 155.6  | 422.7 |
| 155.7  | 423.9 |
| 155.8  | 425 |
| 155.9  | 425.8 |
| 156.0  | 427 |
| 156.1  | 428 |
| 156.2  | 424.1 |
| 156.3  | 430.5 |
| 156.4  | 433 |
| 156.5  | 435.6 |
| 156.6  | 438 |
| 156.7  | 441 |
| 156.8  | 443 |
| 156.9  | 446 |
| 157.0  | 449 |
| 157.1  | 452 |
| 157.2  | 454 |
| 157.3  | 457 |
| 157.4  | 458 |
| 157.5  | 458.9 |
| 157.6  | 459.6 |
| 157.7  | 460 |
| 157.8  | 461 |
| 157.9  | 463 |
| 158.0  | 466.8 |
| 158.1  | 471 |
| 158.2  | 474.4 |
| 158.3  | 479 |
| 158.4  | 483.3 |
| 158.5  | 486.6 |
| 158.6  | 487.9 |
| 158.7  | 489 |
| 158.8  | 490 |
| 158.9  | 491.3 |
| 159.0  | 492.5 |
| 159.1  | 493.3 |
| 159.2  | 492 |
| 159.3  | 494 |
| 159.4  | 497 |
| 159.5  | 496 |
| 159.6  | 497 |
| 159.7  | 502 |
| 159.8  | 501 |
| 159.9  | 505 |
| 160.0  | 508 |
| 160.1  | 509 |
| 160.2  | 509 |
| 160.3  | 509 |
| 160.4  | 507 |
| 160.5  | 512 |
| 160.6  | 513 |
| 160.7  | 515 |
| 160.8  | 517 |
| 160.9  | 523 |
| 161.0  | 526 |
| 161.1  | 533 |
| 161.2  | 533 |
| 161.3  | 543 |
| 161.4  | 544 |
| 161.5  | 543 |
| 161.6  | 553 |
| 161.7  | 556 |
| 161.8  | 556 |
| 161.9  | 566 |
| 162.0  | 566 |
| 162.1  | 574 |
| 162.2  | 577 |
| 162.3  | 581 |
| 162.4  | 587 |
| 162.5  | 589 |
| 162.6  | 597 |
| 162.7  | 597 |
| 162.8  | 601 |
| 162.9  | 604 |
| 163.0  | 614 |
| 163.1  | 614 |
| 163.2  | 616 |
| 163.3  | 627 |
| 163.4  | 626 |
| 163.5  | 633 |
| 163.6  | 637 |
| 163.7  | 643 |
| 163.8  | 641 |
| 163.9  | 636 |
| 164.0  | 636 |
| 164.1  | 637 |
| 164.2  | 633 |
| 164.3  | 628 |
| 164.4  | 617 |
| 164.5  | 615 |
| 164.6  | 614 |
| 164.7  | 612 |
| 164.8  | 606 |
| 164.9  | 605 |
| 165.0  | 597 |
| 165.1  | 593 |
| 165.2  | 588 |
| 165.3  | 585 |
| 165.4  | 586 |
| 165.5  | 574 |
| 165.6  | 567 |
| 165.7  | 565 |
| 165.8  | 566 |
| 165.9  | 556 |
| 166.0  | 555 |
| 166.1  | 558 |
| 166.2  | 546 |
| 166.3  | 544 |
| 166.4  | 535 |
| 166.5  | 533 |
| 166.6  | 528 |
| 166.7  | 522 |
| 166.8  | 514 |
| 166.9  | 517 |
| 167.0  | 509 |
| 167.1  | 505 |
| 167.2  | 502 |
| 167.3  | 497 |
| 167.4  | 494 |
| 167.5  | 490 |
| 167.6  | 485 |
| 167.7  | 483 |
| 167.8  | 477 |
| 167.9  | 476 |
| 168.0  | 473 |
| 168.1  | 469 |
| 168.2  | 464 |
| 168.3  | 462 |
| 168.4  | 457 |
| 168.5  | 455 |
| 168.6  | 452 |
| 168.7  | 446 |
| 168.8  | 445 |
| 168.9  | 433 |
| 169.0  | 432 |
| 169.1  | 423 |
| 169.2  | 427 |
| 169.3  | 417 |
| 169.4  | 405 |
| 169.5  | 404 |
| 169.6  | 405 |
| 169.7  | 400 |
| 169.8  | 393 |
| 169.9  | 390 |
| 170.0  | 385 |
| 170.1  | 384 |
| 170.2  | 377 |
| 170.3  | 373 |
| 170.4  | 365 |
| 170.5  | 362 |
| 170.6  | 353 |
| 170.7  | 351 |
| 170.8  | 345 |
| 170.9  | 342 |
| 171.0  | 337 |
| 171.1  | 335 |
| 171.2  | 321 |
| 171.3  | 324 |
| 171.4  | 316 |
| 171.5  | 316 |
| 171.6  | 305 |
| 171.7  | 303 |
| 171.8  | 297 |
| 171.9  | 293 |
| 172.0  | 284 |
| 172.1  | 282 |
| 172.2  | 276 |
| 172.3  | 277 |
| 172.4  | 271 |
| 172.5  | 265 |
| 172.6  | 265 |
| 172.7  | 253 |
| 172.8  | 252 |
| 172.9  | 247 |
| 173.0  | 241 |
| 173.1  | 242 |
| 173.2  | 239 |
| 173.3  | 239 |
| 173.4  | 237 |
| 173.5  | 235.3 |
| 173.6  | 234.8 |
| 173.7  | 233.9 |
| 173.8  | 232.8 |
| 173.9  | 231.8 |
| 174.0  | 230.9 |
| 174.1  | 229.6 |
| 174.2  | 228.8 |
| 174.3  | 227.9 |
| 174.4  | 226.9 |
| 174.5  | 226 |
| 174.6  | 224 |
| 174.7  | 223 |
| 174.8  | 222 |
| 174.9  | 222 |
| 175.0  | 220 |
| 175.1  | 221.1 |
| 175.2  | 220.8 |
| 175.3  | 220.7 |
| 175.4  | 219.8 |
| 175.5  | 218.6 |
| 175.6  | 216.4 |
| 175.7  | 215.4 |
| 175.8  | 214.1 |
| 175.9  | 213.8 |
| 176.0  | 212.7 |
| 176.1  | 212 |
| 176.2  | 211.8 |
| 176.3  | 211.4 |
| 176.4  | 210.7 |
| 176.5  | 209.7 |
| 176.6  | 209.6 |
| 176.7  | 208.4 |
| 176.8  | 207.4 |
| 176.9  | 206.1 |
| 177.0  | 205.7 |
| 177.1  | 205 |
| 177.2  | 204.2 |
| 177.3  | 203.5 |
| 177.4  | 202.3 |
| 177.5  | 202.1 |
| 177.6  | 200.9 |
| 177.7  | 200.3 |
| 177.8  | 199.1 |
| 177.9  | 198.9 |
| 178.0  | 197.7 |
| 178.1  | 197.4 |
| 178.2  | 196.1 |
| 178.3  | 196 |
| 178.4  | 195.3 |
| 178.5  | 195 |
| 178.6  | 194.3 |
| 178.7  | 193.9 |
| 178.8  | 193.1 |
| 178.9  | 192.3 |
| 179.0  | 191.6 |
| 179.1  | 190.8 |
| 179.2  | 190 |
| 179.3  | 189.1 |
| 179.4  | 188.4 |
| 179.5  | 188.4 |
| 179.6  | 188.5 |
| 179.7  | 188.3 |
| 179.8  | 187.9 |
| 179.9  | 182.1 |
| 180.0  | 185.9 |
| 180.1  | 183.8 |
| 180.2  | 183.1 |
| 180.3  | 182.5 |
| 180.4  | 182.2 |
| 180.5  | 182.2 |
| 180.6  | 181.6 |
| 180.7  | 182.1 |
| 180.8  | 180.3 |
| 180.9  | 180.3 |
| 181.0  | 180.4 |
| 181.1  | 179.5 |
| 181.2  | 178.5 |
| Finish | 178.4 |